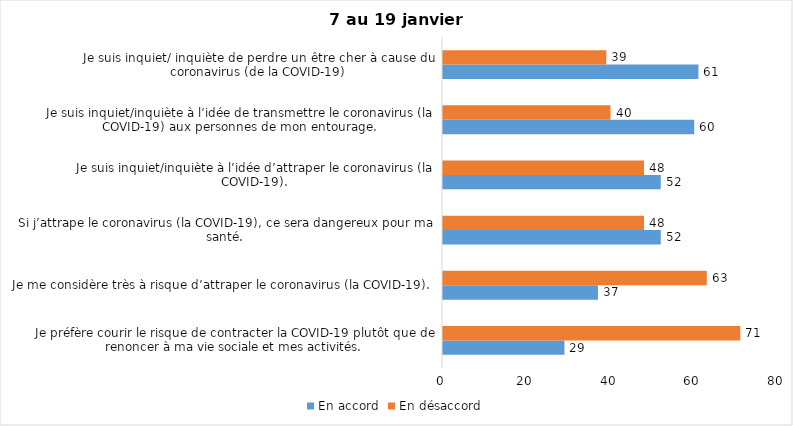
| Category | En accord | En désaccord |
|---|---|---|
| Je préfère courir le risque de contracter la COVID-19 plutôt que de renoncer à ma vie sociale et mes activités. | 29 | 71 |
| Je me considère très à risque d’attraper le coronavirus (la COVID-19). | 37 | 63 |
| Si j’attrape le coronavirus (la COVID-19), ce sera dangereux pour ma santé. | 52 | 48 |
| Je suis inquiet/inquiète à l’idée d’attraper le coronavirus (la COVID-19). | 52 | 48 |
| Je suis inquiet/inquiète à l’idée de transmettre le coronavirus (la COVID-19) aux personnes de mon entourage. | 60 | 40 |
| Je suis inquiet/ inquiète de perdre un être cher à cause du coronavirus (de la COVID-19) | 61 | 39 |